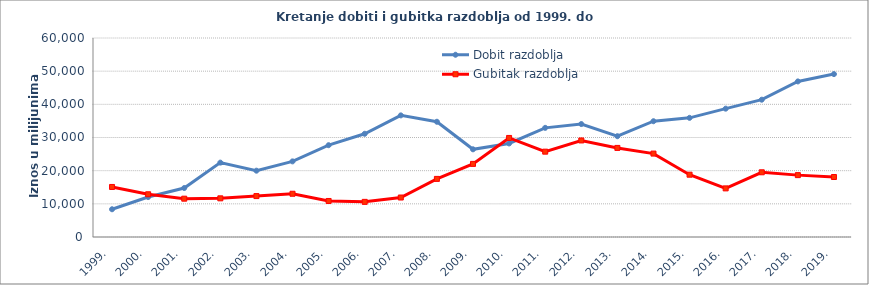
| Category | Dobit razdoblja | Gubitak razdoblja |
|---|---|---|
| 1999. | 8364 | 15085 |
| 2000. | 12046 | 12884 |
| 2001. | 14771 | 11552 |
| 2002. | 22423 | 11658 |
| 2003. | 19994 | 12336 |
| 2004. | 22801 | 13039 |
| 2005. | 27683 | 10861 |
| 2006. | 31121 | 10595 |
| 2007. | 36668 | 11904 |
| 2008. | 34746 | 17517 |
| 2009. | 26438 | 22041 |
| 2010. | 28203 | 29866 |
| 2011. | 32911 | 25731 |
| 2012. | 34053 | 29112 |
| 2013. | 30392 | 26862 |
| 2014. | 34904 | 25150 |
| 2015. | 35925.884 | 18786.38 |
| 2016. | 38695.898 | 14660.642 |
| 2017. | 41397 | 19512 |
| 2018. | 46905 | 18655 |
| 2019. | 49118 | 18089 |